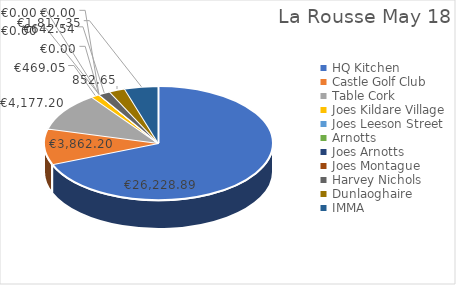
| Category | Series 0 |
|---|---|
| HQ Kitchen | 26228.89 |
| Castle Golf Club | 3862.2 |
| Table Cork | 4177.2 |
| Joes Kildare Village | 469.05 |
| Joes Leeson Street | 0 |
| Arnotts | 0 |
| Joes Arnotts | 0 |
| Joes Montague | 0 |
| Harvey Nichols | 642.54 |
| Dunlaoghaire | 852.65 |
| IMMA | 1817.35 |